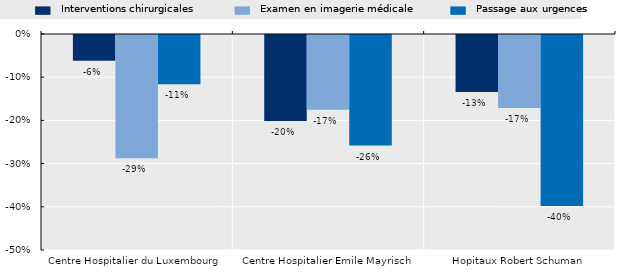
| Category | Interventions chirurgicales | Examen en imagerie médicale | Passage aux urgences |
|---|---|---|---|
| Centre Hospitalier du Luxembourg | -0.059 | -0.286 | -0.114 |
| Centre Hospitalier Emile Mayrisch | -0.199 | -0.173 | -0.256 |
| Hopitaux Robert Schuman | -0.132 | -0.169 | -0.396 |